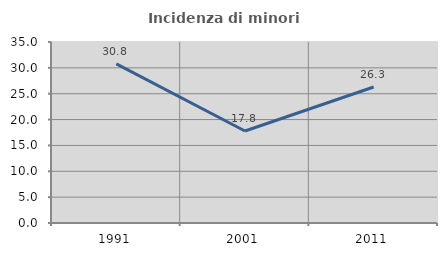
| Category | Incidenza di minori stranieri |
|---|---|
| 1991.0 | 30.769 |
| 2001.0 | 17.797 |
| 2011.0 | 26.298 |